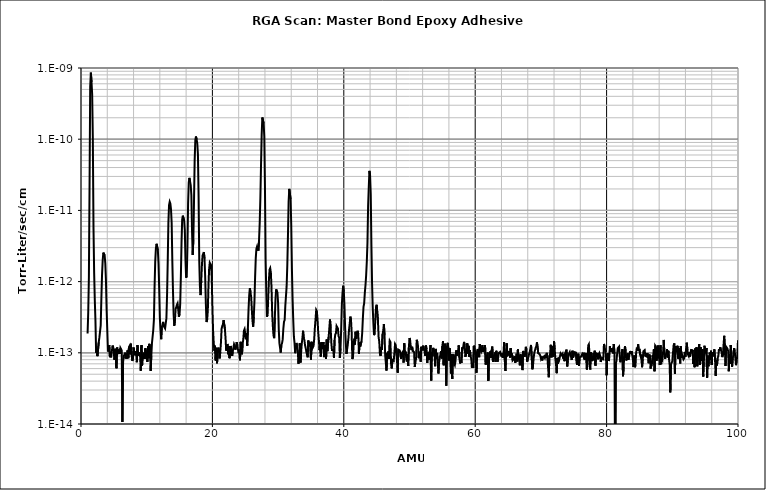
| Category | Series 1 |
|---|---|
| 1.0 | 0 |
| 1.1 | 0 |
| 1.2 | 0 |
| 1.3 | 0 |
| 1.4 | 0 |
| 1.5 | 0 |
| 1.6 | 0 |
| 1.7 | 0 |
| 1.8 | 0 |
| 1.9 | 0 |
| 2.0 | 0 |
| 2.1 | 0 |
| 2.2 | 0 |
| 2.3 | 0 |
| 2.4 | 0 |
| 2.5 | 0 |
| 2.6 | 0 |
| 2.7 | 0 |
| 2.8 | 0 |
| 2.9 | 0 |
| 3.0 | 0 |
| 3.1 | 0 |
| 3.2 | 0 |
| 3.3 | 0 |
| 3.4 | 0 |
| 3.5 | 0 |
| 3.6 | 0 |
| 3.7 | 0 |
| 3.8 | 0 |
| 3.9 | 0 |
| 4.0 | 0 |
| 4.1 | 0 |
| 4.2 | 0 |
| 4.3 | 0 |
| 4.4 | 0 |
| 4.5 | 0 |
| 4.6 | 0 |
| 4.7 | 0 |
| 4.8 | 0 |
| 4.9 | 0 |
| 5.0 | 0 |
| 5.1 | 0 |
| 5.2 | 0 |
| 5.3 | 0 |
| 5.4 | 0 |
| 5.5 | 0 |
| 5.6 | 0 |
| 5.7 | 0 |
| 5.8 | 0 |
| 5.9 | 0 |
| 6.0 | 0 |
| 6.1 | 0 |
| 6.2 | 0 |
| 6.3 | 0 |
| 6.4 | 0 |
| 6.5 | 0 |
| 6.6 | 0 |
| 6.7 | 0 |
| 6.8 | 0 |
| 6.9 | 0 |
| 7.0 | 0 |
| 7.1 | 0 |
| 7.2 | 0 |
| 7.3 | 0 |
| 7.4 | 0 |
| 7.5 | 0 |
| 7.6 | 0 |
| 7.7 | 0 |
| 7.8 | 0 |
| 7.9 | 0 |
| 8.0 | 0 |
| 8.1 | 0 |
| 8.2 | 0 |
| 8.3 | 0 |
| 8.4 | 0 |
| 8.5 | 0 |
| 8.6 | 0 |
| 8.7 | 0 |
| 8.8 | 0 |
| 8.9 | 0 |
| 9.0 | 0 |
| 9.1 | 0 |
| 9.2 | 0 |
| 9.3 | 0 |
| 9.4 | 0 |
| 9.5 | 0 |
| 9.6 | 0 |
| 9.7 | 0 |
| 9.8 | 0 |
| 9.9 | 0 |
| 10.0 | 0 |
| 10.1 | 0 |
| 10.2 | 0 |
| 10.3 | 0 |
| 10.4 | 0 |
| 10.5 | 0 |
| 10.6 | 0 |
| 10.7 | 0 |
| 10.8 | 0 |
| 10.9 | 0 |
| 11.0 | 0 |
| 11.1 | 0 |
| 11.2 | 0 |
| 11.3 | 0 |
| 11.4 | 0 |
| 11.5 | 0 |
| 11.6 | 0 |
| 11.7 | 0 |
| 11.8 | 0 |
| 11.9 | 0 |
| 12.0 | 0 |
| 12.1 | 0 |
| 12.2 | 0 |
| 12.3 | 0 |
| 12.4 | 0 |
| 12.5 | 0 |
| 12.6 | 0 |
| 12.7 | 0 |
| 12.8 | 0 |
| 12.9 | 0 |
| 13.0 | 0 |
| 13.1 | 0 |
| 13.2 | 0 |
| 13.3 | 0 |
| 13.4 | 0 |
| 13.5 | 0 |
| 13.6 | 0 |
| 13.7 | 0 |
| 13.8 | 0 |
| 13.9 | 0 |
| 14.0 | 0 |
| 14.1 | 0 |
| 14.2 | 0 |
| 14.3 | 0 |
| 14.4 | 0 |
| 14.5 | 0 |
| 14.6 | 0 |
| 14.7 | 0 |
| 14.8 | 0 |
| 14.9 | 0 |
| 15.0 | 0 |
| 15.1 | 0 |
| 15.2 | 0 |
| 15.3 | 0 |
| 15.4 | 0 |
| 15.5 | 0 |
| 15.6 | 0 |
| 15.7 | 0 |
| 15.8 | 0 |
| 15.9 | 0 |
| 16.0 | 0 |
| 16.1 | 0 |
| 16.2 | 0 |
| 16.3 | 0 |
| 16.4 | 0 |
| 16.5 | 0 |
| 16.6 | 0 |
| 16.7 | 0 |
| 16.8 | 0 |
| 16.9 | 0 |
| 17.0 | 0 |
| 17.1 | 0 |
| 17.2 | 0 |
| 17.3 | 0 |
| 17.4 | 0 |
| 17.5 | 0 |
| 17.6 | 0 |
| 17.7 | 0 |
| 17.8 | 0 |
| 17.9 | 0 |
| 18.0 | 0 |
| 18.1 | 0 |
| 18.2 | 0 |
| 18.3 | 0 |
| 18.4 | 0 |
| 18.5 | 0 |
| 18.6 | 0 |
| 18.7 | 0 |
| 18.8 | 0 |
| 18.9 | 0 |
| 19.0 | 0 |
| 19.1 | 0 |
| 19.2 | 0 |
| 19.3 | 0 |
| 19.4 | 0 |
| 19.5 | 0 |
| 19.6 | 0 |
| 19.7 | 0 |
| 19.8 | 0 |
| 19.9 | 0 |
| 20.0 | 0 |
| 20.1 | 0 |
| 20.2 | 0 |
| 20.3 | 0 |
| 20.4 | 0 |
| 20.5 | 0 |
| 20.6 | 0 |
| 20.7 | 0 |
| 20.8 | 0 |
| 20.9 | 0 |
| 21.0 | 0 |
| 21.1 | 0 |
| 21.2 | 0 |
| 21.3 | 0 |
| 21.4 | 0 |
| 21.5 | 0 |
| 21.6 | 0 |
| 21.7 | 0 |
| 21.8 | 0 |
| 21.9 | 0 |
| 22.0 | 0 |
| 22.1 | 0 |
| 22.2 | 0 |
| 22.3 | 0 |
| 22.4 | 0 |
| 22.5 | 0 |
| 22.6 | 0 |
| 22.7 | 0 |
| 22.8 | 0 |
| 22.9 | 0 |
| 23.0 | 0 |
| 23.1 | 0 |
| 23.2 | 0 |
| 23.3 | 0 |
| 23.4 | 0 |
| 23.5 | 0 |
| 23.6 | 0 |
| 23.7 | 0 |
| 23.8 | 0 |
| 23.9 | 0 |
| 24.0 | 0 |
| 24.1 | 0 |
| 24.2 | 0 |
| 24.3 | 0 |
| 24.4 | 0 |
| 24.5 | 0 |
| 24.6 | 0 |
| 24.7 | 0 |
| 24.8 | 0 |
| 24.9 | 0 |
| 25.0 | 0 |
| 25.1 | 0 |
| 25.2 | 0 |
| 25.3 | 0 |
| 25.4 | 0 |
| 25.5 | 0 |
| 25.6 | 0 |
| 25.7 | 0 |
| 25.8 | 0 |
| 25.9 | 0 |
| 26.0 | 0 |
| 26.1 | 0 |
| 26.2 | 0 |
| 26.3 | 0 |
| 26.4 | 0 |
| 26.5 | 0 |
| 26.6 | 0 |
| 26.7 | 0 |
| 26.8 | 0 |
| 26.9 | 0 |
| 27.0 | 0 |
| 27.1 | 0 |
| 27.2 | 0 |
| 27.3 | 0 |
| 27.4 | 0 |
| 27.5 | 0 |
| 27.6 | 0 |
| 27.7 | 0 |
| 27.8 | 0 |
| 27.9 | 0 |
| 28.0 | 0 |
| 28.1 | 0 |
| 28.2 | 0 |
| 28.3 | 0 |
| 28.4 | 0 |
| 28.5 | 0 |
| 28.6 | 0 |
| 28.7 | 0 |
| 28.8 | 0 |
| 28.9 | 0 |
| 29.0 | 0 |
| 29.1 | 0 |
| 29.2 | 0 |
| 29.3 | 0 |
| 29.4 | 0 |
| 29.5 | 0 |
| 29.6 | 0 |
| 29.7 | 0 |
| 29.8 | 0 |
| 29.9 | 0 |
| 30.0 | 0 |
| 30.1 | 0 |
| 30.2 | 0 |
| 30.3 | 0 |
| 30.4 | 0 |
| 30.5 | 0 |
| 30.6 | 0 |
| 30.7 | 0 |
| 30.8 | 0 |
| 30.9 | 0 |
| 31.0 | 0 |
| 31.1 | 0 |
| 31.2 | 0 |
| 31.3 | 0 |
| 31.4 | 0 |
| 31.5 | 0 |
| 31.6 | 0 |
| 31.7 | 0 |
| 31.8 | 0 |
| 31.9 | 0 |
| 32.0 | 0 |
| 32.1 | 0 |
| 32.2 | 0 |
| 32.3 | 0 |
| 32.4 | 0 |
| 32.5 | 0 |
| 32.6 | 0 |
| 32.7 | 0 |
| 32.8 | 0 |
| 32.9 | 0 |
| 33.0 | 0 |
| 33.1 | 0 |
| 33.2 | 0 |
| 33.3 | 0 |
| 33.4 | 0 |
| 33.5 | 0 |
| 33.6 | 0 |
| 33.7 | 0 |
| 33.8 | 0 |
| 33.9 | 0 |
| 34.0 | 0 |
| 34.1 | 0 |
| 34.2 | 0 |
| 34.3 | 0 |
| 34.4 | 0 |
| 34.5 | 0 |
| 34.6 | 0 |
| 34.7 | 0 |
| 34.8 | 0 |
| 34.9 | 0 |
| 35.0 | 0 |
| 35.1 | 0 |
| 35.2 | 0 |
| 35.3 | 0 |
| 35.4 | 0 |
| 35.5 | 0 |
| 35.6 | 0 |
| 35.7 | 0 |
| 35.8 | 0 |
| 35.9 | 0 |
| 36.0 | 0 |
| 36.1 | 0 |
| 36.2 | 0 |
| 36.3 | 0 |
| 36.4 | 0 |
| 36.5 | 0 |
| 36.6 | 0 |
| 36.7 | 0 |
| 36.8 | 0 |
| 36.9 | 0 |
| 37.0 | 0 |
| 37.1 | 0 |
| 37.2 | 0 |
| 37.3 | 0 |
| 37.4 | 0 |
| 37.5 | 0 |
| 37.6 | 0 |
| 37.7 | 0 |
| 37.8 | 0 |
| 37.9 | 0 |
| 38.0 | 0 |
| 38.1 | 0 |
| 38.2 | 0 |
| 38.3 | 0 |
| 38.4 | 0 |
| 38.5 | 0 |
| 38.6 | 0 |
| 38.7 | 0 |
| 38.8 | 0 |
| 38.9 | 0 |
| 39.0 | 0 |
| 39.1 | 0 |
| 39.2 | 0 |
| 39.3 | 0 |
| 39.4 | 0 |
| 39.5 | 0 |
| 39.6 | 0 |
| 39.7 | 0 |
| 39.8 | 0 |
| 39.9 | 0 |
| 40.0 | 0 |
| 40.1 | 0 |
| 40.2 | 0 |
| 40.3 | 0 |
| 40.4 | 0 |
| 40.5 | 0 |
| 40.6 | 0 |
| 40.7 | 0 |
| 40.8 | 0 |
| 40.9 | 0 |
| 41.0 | 0 |
| 41.1 | 0 |
| 41.2 | 0 |
| 41.3 | 0 |
| 41.4 | 0 |
| 41.5 | 0 |
| 41.6 | 0 |
| 41.7 | 0 |
| 41.8 | 0 |
| 41.9 | 0 |
| 42.0 | 0 |
| 42.1 | 0 |
| 42.2 | 0 |
| 42.3 | 0 |
| 42.4 | 0 |
| 42.5 | 0 |
| 42.6 | 0 |
| 42.7 | 0 |
| 42.8 | 0 |
| 42.9 | 0 |
| 43.0 | 0 |
| 43.1 | 0 |
| 43.2 | 0 |
| 43.3 | 0 |
| 43.4 | 0 |
| 43.5 | 0 |
| 43.6 | 0 |
| 43.7 | 0 |
| 43.8 | 0 |
| 43.9 | 0 |
| 44.0 | 0 |
| 44.1 | 0 |
| 44.2 | 0 |
| 44.3 | 0 |
| 44.4 | 0 |
| 44.5 | 0 |
| 44.6 | 0 |
| 44.7 | 0 |
| 44.8 | 0 |
| 44.9 | 0 |
| 45.0 | 0 |
| 45.1 | 0 |
| 45.2 | 0 |
| 45.3 | 0 |
| 45.4 | 0 |
| 45.5 | 0 |
| 45.6 | 0 |
| 45.7 | 0 |
| 45.8 | 0 |
| 45.9 | 0 |
| 46.0 | 0 |
| 46.1 | 0 |
| 46.2 | 0 |
| 46.3 | 0 |
| 46.4 | 0 |
| 46.5 | 0 |
| 46.6 | 0 |
| 46.7 | 0 |
| 46.8 | 0 |
| 46.9 | 0 |
| 47.0 | 0 |
| 47.1 | 0 |
| 47.2 | 0 |
| 47.3 | 0 |
| 47.4 | 0 |
| 47.5 | 0 |
| 47.6 | 0 |
| 47.7 | 0 |
| 47.8 | 0 |
| 47.9 | 0 |
| 48.0 | 0 |
| 48.1 | 0 |
| 48.2 | 0 |
| 48.3 | 0 |
| 48.4 | 0 |
| 48.5 | 0 |
| 48.6 | 0 |
| 48.7 | 0 |
| 48.8 | 0 |
| 48.9 | 0 |
| 49.0 | 0 |
| 49.1 | 0 |
| 49.2 | 0 |
| 49.3 | 0 |
| 49.4 | 0 |
| 49.5 | 0 |
| 49.6 | 0 |
| 49.7 | 0 |
| 49.8 | 0 |
| 49.9 | 0 |
| 50.0 | 0 |
| 50.1 | 0 |
| 50.2 | 0 |
| 50.3 | 0 |
| 50.4 | 0 |
| 50.5 | 0 |
| 50.6 | 0 |
| 50.7 | 0 |
| 50.8 | 0 |
| 50.9 | 0 |
| 51.0 | 0 |
| 51.1 | 0 |
| 51.2 | 0 |
| 51.3 | 0 |
| 51.4 | 0 |
| 51.5 | 0 |
| 51.6 | 0 |
| 51.7 | 0 |
| 51.8 | 0 |
| 51.9 | 0 |
| 52.0 | 0 |
| 52.1 | 0 |
| 52.2 | 0 |
| 52.3 | 0 |
| 52.4 | 0 |
| 52.5 | 0 |
| 52.6 | 0 |
| 52.7 | 0 |
| 52.8 | 0 |
| 52.9 | 0 |
| 53.0 | 0 |
| 53.1 | 0 |
| 53.2 | 0 |
| 53.3 | 0 |
| 53.4 | 0 |
| 53.5 | 0 |
| 53.6 | 0 |
| 53.7 | 0 |
| 53.8 | 0 |
| 53.9 | 0 |
| 54.0 | 0 |
| 54.1 | 0 |
| 54.2 | 0 |
| 54.3 | 0 |
| 54.4 | 0 |
| 54.5 | 0 |
| 54.6 | 0 |
| 54.7 | 0 |
| 54.8 | 0 |
| 54.9 | 0 |
| 55.0 | 0 |
| 55.1 | 0 |
| 55.2 | 0 |
| 55.3 | 0 |
| 55.4 | 0 |
| 55.5 | 0 |
| 55.6 | 0 |
| 55.7 | 0 |
| 55.8 | 0 |
| 55.9 | 0 |
| 56.0 | 0 |
| 56.1 | 0 |
| 56.2 | 0 |
| 56.3 | 0 |
| 56.4 | 0 |
| 56.5 | 0 |
| 56.6 | 0 |
| 56.7 | 0 |
| 56.8 | 0 |
| 56.9 | 0 |
| 57.0 | 0 |
| 57.1 | 0 |
| 57.2 | 0 |
| 57.3 | 0 |
| 57.4 | 0 |
| 57.5 | 0 |
| 57.6 | 0 |
| 57.7 | 0 |
| 57.8 | 0 |
| 57.9 | 0 |
| 58.0 | 0 |
| 58.1 | 0 |
| 58.2 | 0 |
| 58.3 | 0 |
| 58.4 | 0 |
| 58.5 | 0 |
| 58.6 | 0 |
| 58.7 | 0 |
| 58.8 | 0 |
| 58.9 | 0 |
| 59.0 | 0 |
| 59.1 | 0 |
| 59.2 | 0 |
| 59.3 | 0 |
| 59.4 | 0 |
| 59.5 | 0 |
| 59.6 | 0 |
| 59.7 | 0 |
| 59.8 | 0 |
| 59.9 | 0 |
| 60.0 | 0 |
| 60.1 | 0 |
| 60.2 | 0 |
| 60.3 | 0 |
| 60.4 | 0 |
| 60.5 | 0 |
| 60.6 | 0 |
| 60.7 | 0 |
| 60.8 | 0 |
| 60.9 | 0 |
| 61.0 | 0 |
| 61.1 | 0 |
| 61.2 | 0 |
| 61.3 | 0 |
| 61.4 | 0 |
| 61.5 | 0 |
| 61.6 | 0 |
| 61.7 | 0 |
| 61.8 | 0 |
| 61.9 | 0 |
| 62.0 | 0 |
| 62.1 | 0 |
| 62.2 | 0 |
| 62.3 | 0 |
| 62.4 | 0 |
| 62.5 | 0 |
| 62.6 | 0 |
| 62.7 | 0 |
| 62.8 | 0 |
| 62.9 | 0 |
| 63.0 | 0 |
| 63.1 | 0 |
| 63.2 | 0 |
| 63.3 | 0 |
| 63.4 | 0 |
| 63.5 | 0 |
| 63.6 | 0 |
| 63.7 | 0 |
| 63.8 | 0 |
| 63.9 | 0 |
| 64.0 | 0 |
| 64.1 | 0 |
| 64.2 | 0 |
| 64.3 | 0 |
| 64.4 | 0 |
| 64.5 | 0 |
| 64.6 | 0 |
| 64.7 | 0 |
| 64.8 | 0 |
| 64.9 | 0 |
| 65.0 | 0 |
| 65.1 | 0 |
| 65.2 | 0 |
| 65.3 | 0 |
| 65.4 | 0 |
| 65.5 | 0 |
| 65.6 | 0 |
| 65.7 | 0 |
| 65.8 | 0 |
| 65.9 | 0 |
| 66.0 | 0 |
| 66.1 | 0 |
| 66.2 | 0 |
| 66.3 | 0 |
| 66.4 | 0 |
| 66.5 | 0 |
| 66.6 | 0 |
| 66.7 | 0 |
| 66.8 | 0 |
| 66.9 | 0 |
| 67.0 | 0 |
| 67.1 | 0 |
| 67.2 | 0 |
| 67.3 | 0 |
| 67.4 | 0 |
| 67.5 | 0 |
| 67.6 | 0 |
| 67.7 | 0 |
| 67.8 | 0 |
| 67.9 | 0 |
| 68.0 | 0 |
| 68.1 | 0 |
| 68.2 | 0 |
| 68.3 | 0 |
| 68.4 | 0 |
| 68.5 | 0 |
| 68.6 | 0 |
| 68.7 | 0 |
| 68.8 | 0 |
| 68.9 | 0 |
| 69.0 | 0 |
| 69.1 | 0 |
| 69.2 | 0 |
| 69.3 | 0 |
| 69.4 | 0 |
| 69.5 | 0 |
| 69.6 | 0 |
| 69.7 | 0 |
| 69.8 | 0 |
| 69.9 | 0 |
| 70.0 | 0 |
| 70.1 | 0 |
| 70.2 | 0 |
| 70.3 | 0 |
| 70.4 | 0 |
| 70.5 | 0 |
| 70.6 | 0 |
| 70.7 | 0 |
| 70.8 | 0 |
| 70.9 | 0 |
| 71.0 | 0 |
| 71.1 | 0 |
| 71.2 | 0 |
| 71.3 | 0 |
| 71.4 | 0 |
| 71.5 | 0 |
| 71.6 | 0 |
| 71.7 | 0 |
| 71.8 | 0 |
| 71.9 | 0 |
| 72.0 | 0 |
| 72.1 | 0 |
| 72.2 | 0 |
| 72.3 | 0 |
| 72.4 | 0 |
| 72.5 | 0 |
| 72.6 | 0 |
| 72.7 | 0 |
| 72.8 | 0 |
| 72.9 | 0 |
| 73.0 | 0 |
| 73.1 | 0 |
| 73.2 | 0 |
| 73.3 | 0 |
| 73.4 | 0 |
| 73.5 | 0 |
| 73.6 | 0 |
| 73.7 | 0 |
| 73.8 | 0 |
| 73.9 | 0 |
| 74.0 | 0 |
| 74.1 | 0 |
| 74.2 | 0 |
| 74.3 | 0 |
| 74.4 | 0 |
| 74.5 | 0 |
| 74.6 | 0 |
| 74.7 | 0 |
| 74.8 | 0 |
| 74.9 | 0 |
| 75.0 | 0 |
| 75.1 | 0 |
| 75.2 | 0 |
| 75.3 | 0 |
| 75.4 | 0 |
| 75.5 | 0 |
| 75.6 | 0 |
| 75.7 | 0 |
| 75.8 | 0 |
| 75.9 | 0 |
| 76.0 | 0 |
| 76.1 | 0 |
| 76.2 | 0 |
| 76.3 | 0 |
| 76.4 | 0 |
| 76.5 | 0 |
| 76.6 | 0 |
| 76.7 | 0 |
| 76.8 | 0 |
| 76.9 | 0 |
| 77.0 | 0 |
| 77.1 | 0 |
| 77.2 | 0 |
| 77.3 | 0 |
| 77.4 | 0 |
| 77.5 | 0 |
| 77.6 | 0 |
| 77.7 | 0 |
| 77.8 | 0 |
| 77.9 | 0 |
| 78.0 | 0 |
| 78.1 | 0 |
| 78.2 | 0 |
| 78.3 | 0 |
| 78.4 | 0 |
| 78.5 | 0 |
| 78.6 | 0 |
| 78.7 | 0 |
| 78.8 | 0 |
| 78.9 | 0 |
| 79.0 | 0 |
| 79.1 | 0 |
| 79.2 | 0 |
| 79.3 | 0 |
| 79.4 | 0 |
| 79.5 | 0 |
| 79.6 | 0 |
| 79.7 | 0 |
| 79.8 | 0 |
| 79.9 | 0 |
| 80.0 | 0 |
| 80.1 | 0 |
| 80.2 | 0 |
| 80.3 | 0 |
| 80.4 | 0 |
| 80.5 | 0 |
| 80.6 | 0 |
| 80.7 | 0 |
| 80.8 | 0 |
| 80.9 | 0 |
| 81.0 | 0 |
| 81.1 | 0 |
| 81.2 | 0 |
| 81.3 | 0 |
| 81.4 | 0 |
| 81.5 | 0 |
| 81.6 | 0 |
| 81.7 | 0 |
| 81.8 | 0 |
| 81.9 | 0 |
| 82.0 | 0 |
| 82.1 | 0 |
| 82.2 | 0 |
| 82.3 | 0 |
| 82.4 | 0 |
| 82.5 | 0 |
| 82.6 | 0 |
| 82.7 | 0 |
| 82.8 | 0 |
| 82.9 | 0 |
| 83.0 | 0 |
| 83.1 | 0 |
| 83.2 | 0 |
| 83.3 | 0 |
| 83.4 | 0 |
| 83.5 | 0 |
| 83.6 | 0 |
| 83.7 | 0 |
| 83.8 | 0 |
| 83.9 | 0 |
| 84.0 | 0 |
| 84.1 | 0 |
| 84.2 | 0 |
| 84.3 | 0 |
| 84.4 | 0 |
| 84.5 | 0 |
| 84.6 | 0 |
| 84.7 | 0 |
| 84.8 | 0 |
| 84.9 | 0 |
| 85.0 | 0 |
| 85.1 | 0 |
| 85.2 | 0 |
| 85.3 | 0 |
| 85.4 | 0 |
| 85.5 | 0 |
| 85.6 | 0 |
| 85.7 | 0 |
| 85.8 | 0 |
| 85.9 | 0 |
| 86.0 | 0 |
| 86.1 | 0 |
| 86.2 | 0 |
| 86.3 | 0 |
| 86.4 | 0 |
| 86.5 | 0 |
| 86.6 | 0 |
| 86.7 | 0 |
| 86.8 | 0 |
| 86.9 | 0 |
| 87.0 | 0 |
| 87.1 | 0 |
| 87.2 | 0 |
| 87.3 | 0 |
| 87.4 | 0 |
| 87.5 | 0 |
| 87.6 | 0 |
| 87.7 | 0 |
| 87.8 | 0 |
| 87.9 | 0 |
| 88.0 | 0 |
| 88.1 | 0 |
| 88.2 | 0 |
| 88.3 | 0 |
| 88.4 | 0 |
| 88.5 | 0 |
| 88.6 | 0 |
| 88.7 | 0 |
| 88.8 | 0 |
| 88.9 | 0 |
| 89.0 | 0 |
| 89.1 | 0 |
| 89.2 | 0 |
| 89.3 | 0 |
| 89.4 | 0 |
| 89.5 | 0 |
| 89.6 | 0 |
| 89.7 | 0 |
| 89.8 | 0 |
| 89.9 | 0 |
| 90.0 | 0 |
| 90.1 | 0 |
| 90.2 | 0 |
| 90.3 | 0 |
| 90.4 | 0 |
| 90.5 | 0 |
| 90.6 | 0 |
| 90.7 | 0 |
| 90.8 | 0 |
| 90.9 | 0 |
| 91.0 | 0 |
| 91.1 | 0 |
| 91.2 | 0 |
| 91.3 | 0 |
| 91.4 | 0 |
| 91.5 | 0 |
| 91.6 | 0 |
| 91.7 | 0 |
| 91.8 | 0 |
| 91.9 | 0 |
| 92.0 | 0 |
| 92.1 | 0 |
| 92.2 | 0 |
| 92.3 | 0 |
| 92.4 | 0 |
| 92.5 | 0 |
| 92.6 | 0 |
| 92.7 | 0 |
| 92.8 | 0 |
| 92.9 | 0 |
| 93.0 | 0 |
| 93.1 | 0 |
| 93.2 | 0 |
| 93.3 | 0 |
| 93.4 | 0 |
| 93.5 | 0 |
| 93.6 | 0 |
| 93.7 | 0 |
| 93.8 | 0 |
| 93.9 | 0 |
| 94.0 | 0 |
| 94.1 | 0 |
| 94.2 | 0 |
| 94.3 | 0 |
| 94.4 | 0 |
| 94.5 | 0 |
| 94.6 | 0 |
| 94.7 | 0 |
| 94.8 | 0 |
| 94.9 | 0 |
| 95.0 | 0 |
| 95.1 | 0 |
| 95.2 | 0 |
| 95.3 | 0 |
| 95.4 | 0 |
| 95.5 | 0 |
| 95.6 | 0 |
| 95.7 | 0 |
| 95.8 | 0 |
| 95.9 | 0 |
| 96.0 | 0 |
| 96.1 | 0 |
| 96.2 | 0 |
| 96.3 | 0 |
| 96.4 | 0 |
| 96.5 | 0 |
| 96.6 | 0 |
| 96.7 | 0 |
| 96.8 | 0 |
| 96.9 | 0 |
| 97.0 | 0 |
| 97.1 | 0 |
| 97.2 | 0 |
| 97.3 | 0 |
| 97.4 | 0 |
| 97.5 | 0 |
| 97.6 | 0 |
| 97.7 | 0 |
| 97.8 | 0 |
| 97.9 | 0 |
| 98.0 | 0 |
| 98.1 | 0 |
| 98.2 | 0 |
| 98.3 | 0 |
| 98.4 | 0 |
| 98.5 | 0 |
| 98.6 | 0 |
| 98.7 | 0 |
| 98.8 | 0 |
| 98.9 | 0 |
| 99.0 | 0 |
| 99.1 | 0 |
| 99.2 | 0 |
| 99.3 | 0 |
| 99.4 | 0 |
| 99.5 | 0 |
| 99.6 | 0 |
| 99.7 | 0 |
| 99.8 | 0 |
| 99.9 | 0 |
| 100.0 | 0 |